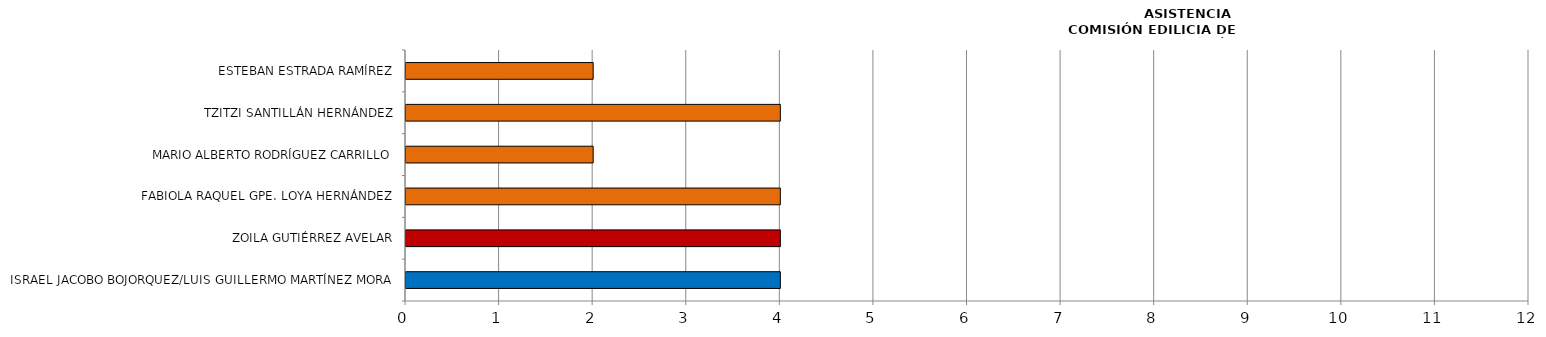
| Category | Series 0 |
|---|---|
| ISRAEL JACOBO BOJORQUEZ/LUIS GUILLERMO MARTÍNEZ MORA | 4 |
| ZOILA GUTIÉRREZ AVELAR | 4 |
| FABIOLA RAQUEL GPE. LOYA HERNÁNDEZ | 4 |
| MARIO ALBERTO RODRÍGUEZ CARRILLO | 2 |
| TZITZI SANTILLÁN HERNÁNDEZ | 4 |
| ESTEBAN ESTRADA RAMÍREZ | 2 |